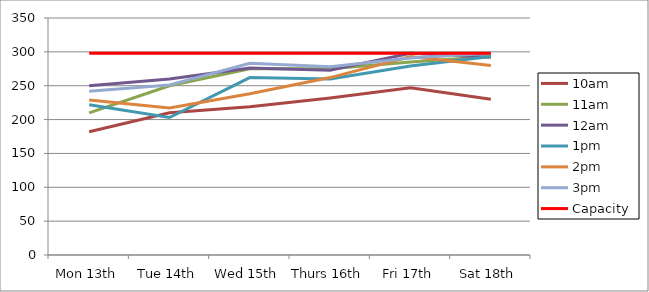
| Category | 9am | 10am | 11am | 12am | 1pm | 2pm | 3pm | 4pm | 5pm | Capacity |
|---|---|---|---|---|---|---|---|---|---|---|
| Mon 13th |  | 182 | 210 | 250 | 222 | 229 | 242 |  |  | 298 |
| Tue 14th |  | 210 | 250 | 260 | 203 | 217 | 251 |  |  | 298 |
| Wed 15th |  | 219 | 275 | 276 | 262 | 238 | 283 |  |  | 298 |
| Thurs 16th |  | 232 | 275 | 273 | 260 | 262 | 278 |  |  | 298 |
| Fri 17th |  | 247 | 285 | 298 | 279 | 293 | 291 |  |  | 298 |
| Sat 18th |  | 230 | 293 | 292 | 293 | 280 | 298 |  |  | 298 |